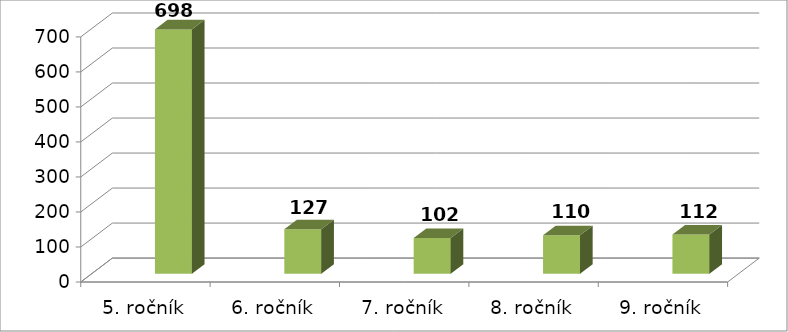
| Category | Series 0 | Series 2 |
|---|---|---|
| 5. ročník |  | 698 |
| 6. ročník |  | 127 |
| 7. ročník |  | 102 |
| 8. ročník |  | 110 |
| 9. ročník |  | 112 |